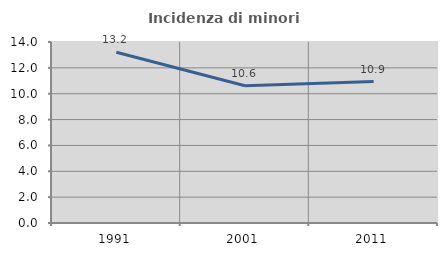
| Category | Incidenza di minori stranieri |
|---|---|
| 1991.0 | 13.208 |
| 2001.0 | 10.615 |
| 2011.0 | 10.938 |